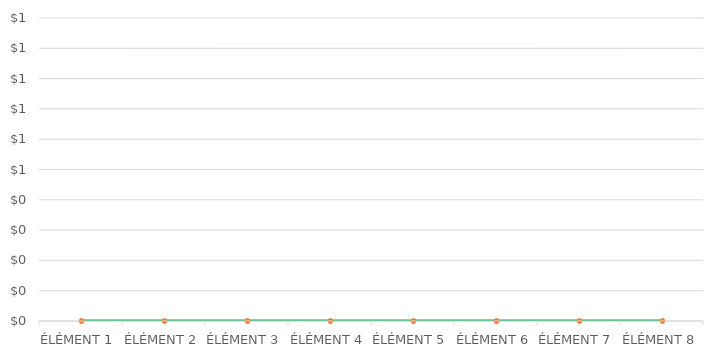
| Category | Series 1 |
|---|---|
| ÉLÉMENT 1 | 0 |
| ÉLÉMENT 2 | 0 |
| ÉLÉMENT 3 | 0 |
| ÉLÉMENT 4 | 0 |
| ÉLÉMENT 5 | 0 |
| ÉLÉMENT 6 | 0 |
| ÉLÉMENT 7 | 0 |
| ÉLÉMENT 8 | 0 |